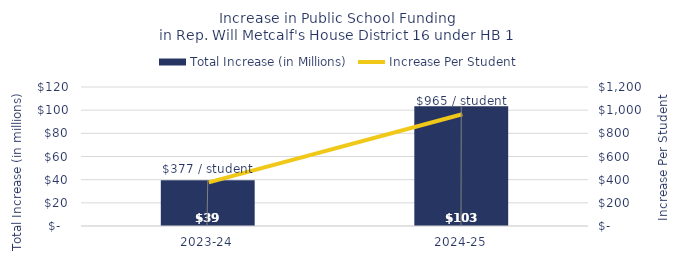
| Category | Total Increase (in Millions) |
|---|---|
| 2023-24 | 39.458 |
| 2024-25 | 103.321 |